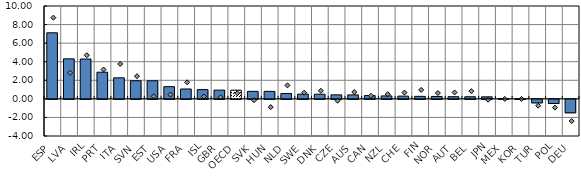
| Category | Average deviation of long-term unemployment in 2016q1 from pre-crisis rate |
|---|---|
| ESP | 7.115 |
| LVA | 4.308 |
| IRL | 4.289 |
| PRT | 2.869 |
| ITA | 2.264 |
| SVN | 1.951 |
| EST | 1.946 |
| USA | 1.314 |
| FRA | 1.064 |
| ISL | 0.996 |
| GBR | 0.941 |
| OECD | 0.935 |
| SVK | 0.809 |
| HUN | 0.808 |
| NLD | 0.578 |
| SWE | 0.507 |
| DNK | 0.498 |
| CZE | 0.431 |
| AUS | 0.427 |
| CAN | 0.356 |
| NZL | 0.316 |
| CHE | 0.294 |
| FIN | 0.27 |
| NOR | 0.259 |
| AUT | 0.234 |
| BEL | 0.228 |
| JPN | 0.218 |
| MEX | 0.014 |
| KOR | -0.011 |
| TUR | -0.379 |
| POL | -0.447 |
| DEU | -1.451 |